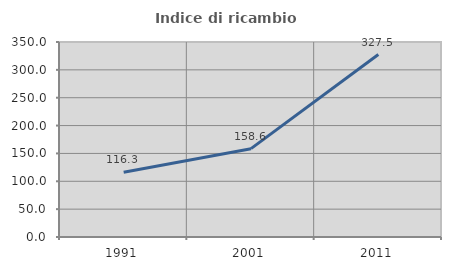
| Category | Indice di ricambio occupazionale  |
|---|---|
| 1991.0 | 116.327 |
| 2001.0 | 158.571 |
| 2011.0 | 327.473 |